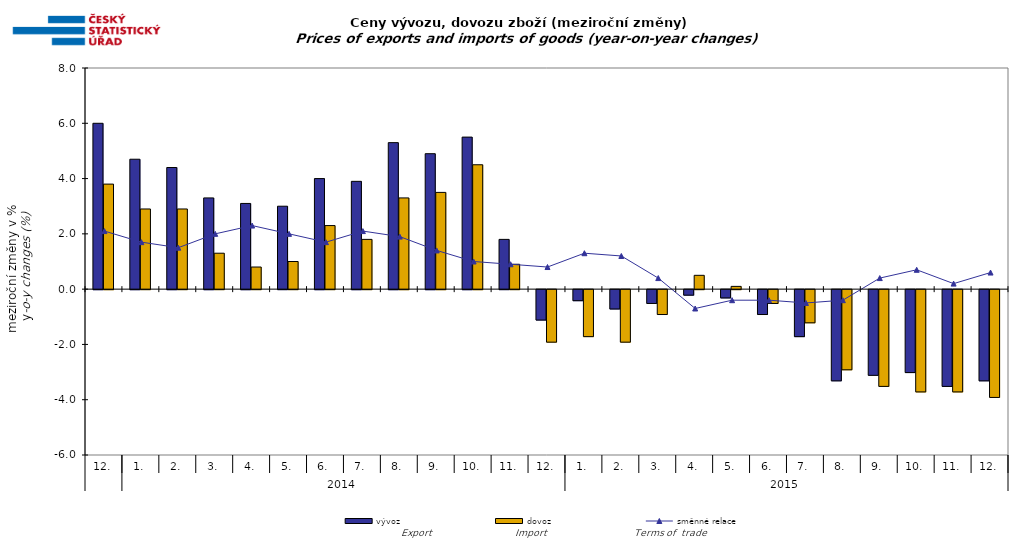
| Category | vývoz | dovoz |
|---|---|---|
| 0 | 6 | 3.8 |
| 1 | 4.7 | 2.9 |
| 2 | 4.4 | 2.9 |
| 3 | 3.3 | 1.3 |
| 4 | 3.1 | 0.8 |
| 5 | 3 | 1 |
| 6 | 4 | 2.3 |
| 7 | 3.9 | 1.8 |
| 8 | 5.3 | 3.3 |
| 9 | 4.9 | 3.5 |
| 10 | 5.5 | 4.5 |
| 11 | 1.8 | 0.9 |
| 12 | -1.1 | -1.9 |
| 13 | -0.4 | -1.7 |
| 14 | -0.7 | -1.9 |
| 15 | -0.5 | -0.9 |
| 16 | -0.2 | 0.5 |
| 17 | -0.3 | 0.1 |
| 18 | -0.9 | -0.5 |
| 19 | -1.7 | -1.2 |
| 20 | -3.3 | -2.9 |
| 21 | -3.1 | -3.5 |
| 22 | -3 | -3.7 |
| 23 | -3.5 | -3.7 |
| 24 | -3.3 | -3.9 |